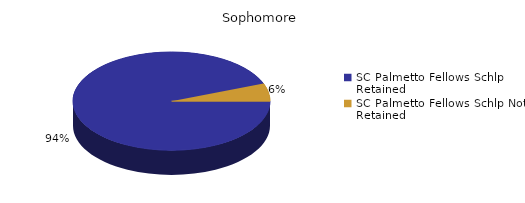
| Category | Sophomore |
|---|---|
| SC Palmetto Fellows Schlp Retained  | 518 |
| SC Palmetto Fellows Schlp Not Retained  | 32 |